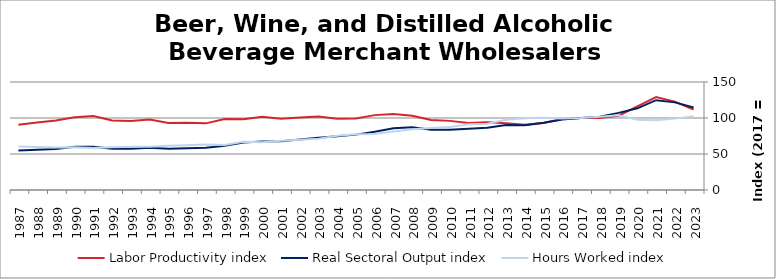
| Category | Labor Productivity index | Real Sectoral Output index | Hours Worked index |
|---|---|---|---|
| 2023.0 | 111.756 | 114.578 | 102.525 |
| 2022.0 | 122.759 | 121.693 | 99.132 |
| 2021.0 | 128.961 | 124.738 | 96.726 |
| 2020.0 | 116.261 | 113.469 | 97.599 |
| 2019.0 | 103.139 | 107.135 | 103.874 |
| 2018.0 | 100.125 | 101.895 | 101.768 |
| 2017.0 | 100 | 100 | 100 |
| 2016.0 | 98.571 | 98.055 | 99.477 |
| 2015.0 | 93.072 | 93.433 | 100.388 |
| 2014.0 | 90.495 | 90.097 | 99.56 |
| 2013.0 | 92.776 | 90.434 | 97.476 |
| 2012.0 | 93.97 | 86.422 | 91.968 |
| 2011.0 | 93.214 | 84.984 | 91.171 |
| 2010.0 | 96.007 | 83.848 | 87.336 |
| 2009.0 | 97.25 | 83.593 | 85.957 |
| 2008.0 | 103.102 | 87.135 | 84.513 |
| 2007.0 | 105.494 | 85.85 | 81.379 |
| 2006.0 | 103.995 | 81.03 | 77.917 |
| 2005.0 | 99.321 | 76.906 | 77.432 |
| 2004.0 | 99.128 | 74.648 | 75.305 |
| 2003.0 | 102.009 | 72.697 | 71.265 |
| 2002.0 | 100.758 | 70.24 | 69.711 |
| 2001.0 | 99.077 | 67.711 | 68.342 |
| 2000.0 | 101.679 | 67.305 | 66.193 |
| 1999.0 | 98.105 | 65.866 | 67.138 |
| 1998.0 | 98.719 | 61.598 | 62.398 |
| 1997.0 | 92.553 | 58.584 | 63.298 |
| 1996.0 | 93.313 | 57.971 | 62.126 |
| 1995.0 | 93.047 | 57.208 | 61.483 |
| 1994.0 | 97.822 | 58.658 | 59.964 |
| 1993.0 | 95.666 | 57.37 | 59.969 |
| 1992.0 | 96.559 | 57.461 | 59.509 |
| 1991.0 | 102.62 | 60.029 | 58.497 |
| 1990.0 | 100.951 | 60.098 | 59.532 |
| 1989.0 | 96.38 | 56.784 | 58.916 |
| 1988.0 | 93.709 | 55.947 | 59.703 |
| 1987.0 | 90.648 | 54.727 | 60.374 |